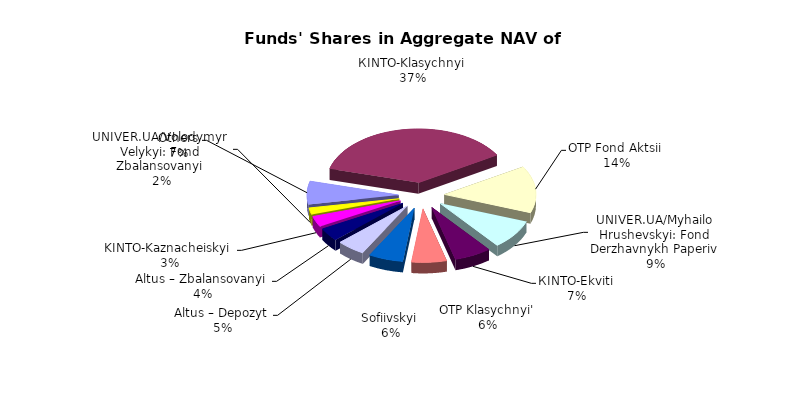
| Category | Series 0 | Series 1 |
|---|---|---|
| Others | 5810664.572 | 0.069 |
| КІNТО-Klasychnyi | 31221170.26 | 0.372 |
| OTP Fond Aktsii | 11884836.75 | 0.142 |
| UNIVER.UA/Myhailo Hrushevskyi: Fond Derzhavnykh Paperiv | 7355297.66 | 0.088 |
| КІNTO-Ekviti | 5486669.51 | 0.065 |
| OTP Klasychnyi' | 5165686.15 | 0.062 |
| Sofiivskyi | 5104668.98 | 0.061 |
| Altus – Depozyt | 4226090.07 | 0.05 |
| Altus – Zbalansovanyi | 3293249.38 | 0.039 |
| KINTO-Kaznacheiskyi | 2664066.97 | 0.032 |
| UNIVER.UA/Volodymyr Velykyi: Fond Zbalansovanyi | 1672826.09 | 0.02 |